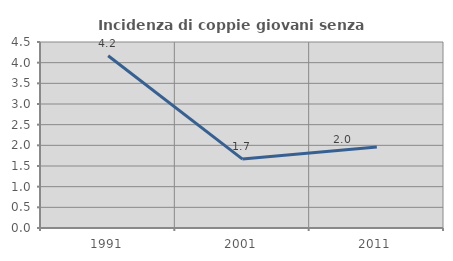
| Category | Incidenza di coppie giovani senza figli |
|---|---|
| 1991.0 | 4.167 |
| 2001.0 | 1.667 |
| 2011.0 | 1.961 |